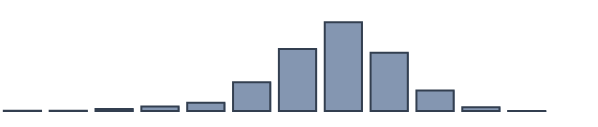
| Category | Series 0 |
|---|---|
| 0 | 0.13 |
| 1 | 0.13 |
| 2 | 0.696 |
| 3 | 1.609 |
| 4 | 2.957 |
| 5 | 10.391 |
| 6 | 22.348 |
| 7 | 31.957 |
| 8 | 21 |
| 9 | 7.348 |
| 10 | 1.391 |
| 11 | 0.043 |
| 12 | 0 |